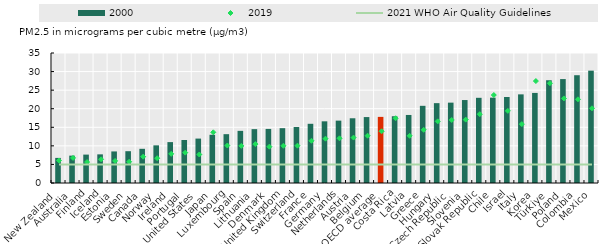
| Category | 2000 |
|---|---|
| New Zealand | 6.757 |
| Australia | 7.366 |
| Finland | 7.646 |
| Iceland | 7.711 |
| Estonia | 8.499 |
| Sweden | 8.564 |
| Canada | 9.204 |
| Norway | 10.138 |
| Ireland | 11.011 |
| Portugal | 11.581 |
| United States | 11.959 |
| Japan | 12.984 |
| Luxembourg | 13.148 |
| Spain | 14.039 |
| Lithuania | 14.501 |
| Denmark | 14.558 |
| United Kingdom | 14.764 |
| Switzerland | 15.073 |
| France | 15.939 |
| Germany | 16.606 |
| Netherlands | 16.793 |
| Austria | 17.429 |
| Belgium | 17.751 |
| OECD average | 17.8 |
| Costa Rica | 17.974 |
| Latvia | 18.316 |
| Greece | 20.779 |
| Hungary | 21.5 |
| Czech Republic | 21.636 |
| Slovenia | 22.336 |
| Slovak Republic | 22.937 |
| Chile | 22.98 |
| Israel | 23.156 |
| Italy | 23.864 |
| Korea | 24.251 |
| Türkiye | 27.667 |
| Poland | 27.979 |
| Colombia | 29.02 |
| Mexico | 30.248 |